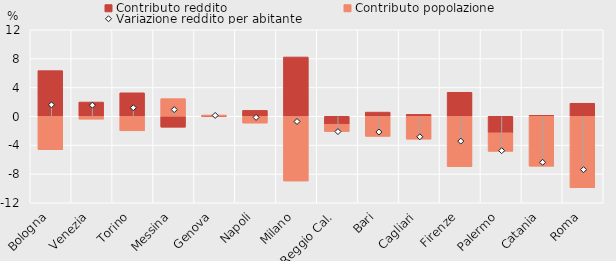
| Category | Contributo reddito | Contributo popolazione |
|---|---|---|
| Bologna | 6.33 | -4.639 |
| Venezia | 1.978 | -0.402 |
| Torino | 3.258 | -2.016 |
| Messina | -1.517 | 2.45 |
| Genova | -0.031 | 0.178 |
| Napoli | 0.82 | -0.945 |
| Milano | 8.227 | -8.982 |
| Reggio Cal. | -1.102 | -1.014 |
| Bari | 0.581 | -2.787 |
| Cagliari | 0.271 | -3.174 |
| Firenze | 3.33 | -6.98 |
| Palermo | -2.288 | -2.574 |
| Catania | 0.131 | -6.923 |
| Roma | 1.806 | -9.916 |